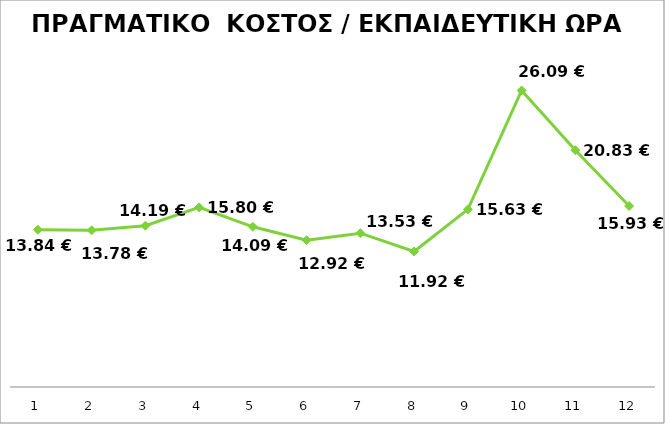
| Category | ΠΡΑΓΜΑΤΙΚΟ  ΚΟΣΤΟΣ / ΕΚΠΑΙΔΕΥΤΙΚΗ ΩΡΑ |
|---|---|
| 0 | 13.837 |
| 1 | 13.784 |
| 2 | 14.186 |
| 3 | 15.802 |
| 4 | 14.095 |
| 5 | 12.916 |
| 6 | 13.532 |
| 7 | 11.92 |
| 8 | 15.625 |
| 9 | 26.089 |
| 10 | 20.834 |
| 11 | 15.926 |